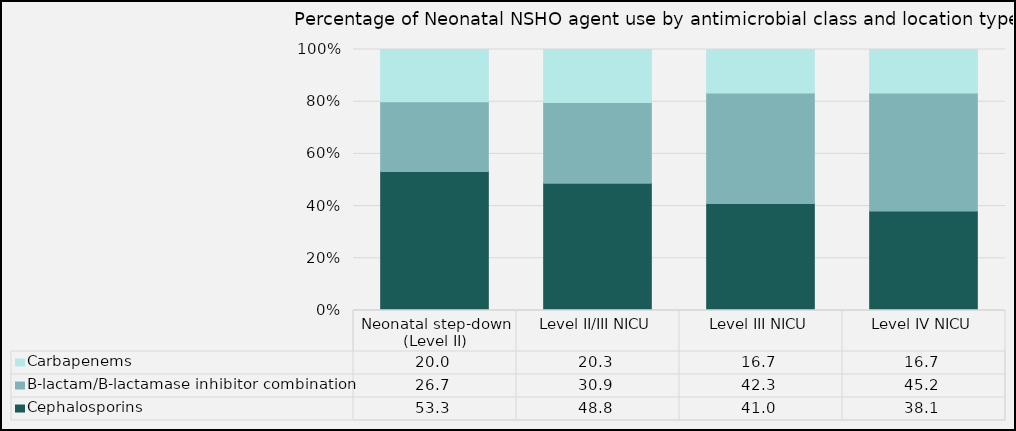
| Category | Cephalosporins | Β-lactam/Β-lactamase inhibitor combination | Carbapenems |
|---|---|---|---|
| Neonatal step-down (Level II) | 53.27 | 26.73 | 20 |
| Level II/III NICU | 48.76 | 30.91 | 20.33 |
| Level III NICU | 41.02 | 42.28 | 16.71 |
| Level IV NICU | 38.11 | 45.22 | 16.67 |